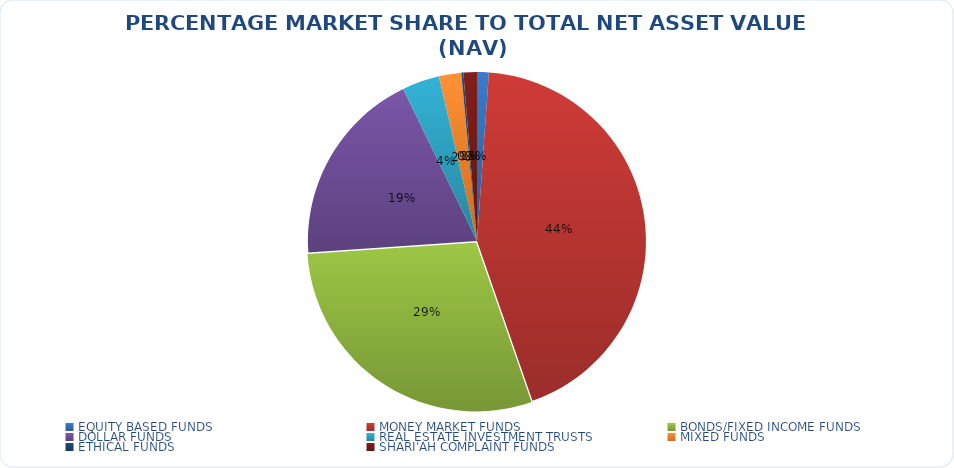
| Category | NET ASSET VALUE |
|---|---|
| EQUITY BASED FUNDS | 15742938652.88 |
| MONEY MARKET FUNDS | 610707740903.57 |
| BONDS/FIXED INCOME FUNDS | 409918332066.03 |
| DOLLAR FUNDS | 264922325413.638 |
| REAL ESTATE INVESTMENT TRUSTS | 50114329840.06 |
| MIXED FUNDS | 29969826835.536 |
| ETHICAL FUNDS | 2706121776.49 |
| SHARI'AH COMPLAINT FUNDS | 18065510874.77 |